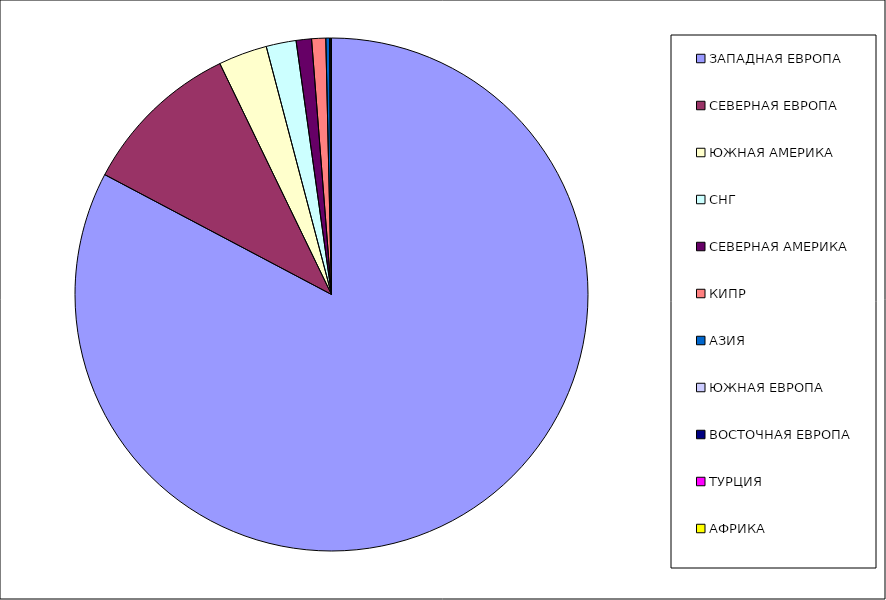
| Category | Оборот |
|---|---|
| ЗАПАДНАЯ ЕВРОПА | 0.827 |
| СЕВЕРНАЯ ЕВРОПА | 0.101 |
| ЮЖНАЯ АМЕРИКА | 0.031 |
| СНГ | 0.019 |
| СЕВЕРНАЯ АМЕРИКА | 0.01 |
| КИПР | 0.009 |
| АЗИЯ | 0.002 |
| ЮЖНАЯ ЕВРОПА | 0.001 |
| ВОСТОЧНАЯ ЕВРОПА | 0 |
| ТУРЦИЯ | 0 |
| АФРИКА | 0 |